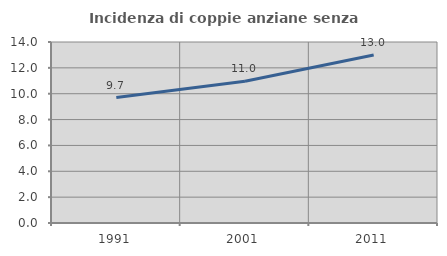
| Category | Incidenza di coppie anziane senza figli  |
|---|---|
| 1991.0 | 9.703 |
| 2001.0 | 10.963 |
| 2011.0 | 13 |